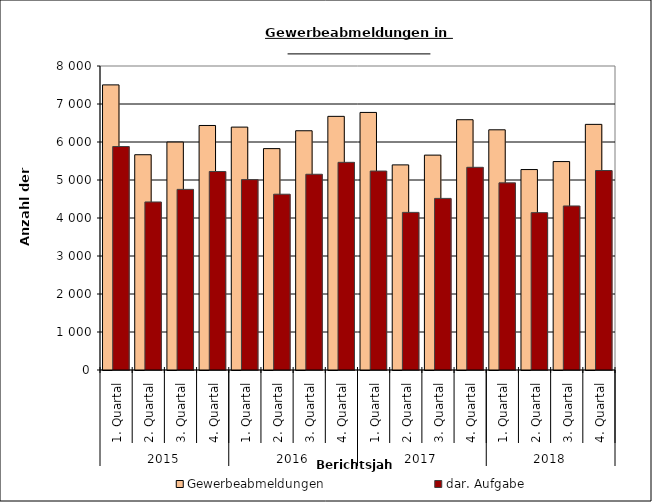
| Category | Gewerbeabmeldungen | dar. Aufgabe |
|---|---|---|
| 0 | 7503 | 5881 |
| 1 | 5665 | 4422 |
| 2 | 5998 | 4753 |
| 3 | 6435 | 5224 |
| 4 | 6392 | 5010 |
| 5 | 5826 | 4626 |
| 6 | 6296 | 5151 |
| 7 | 6675 | 5465 |
| 8 | 6778 | 5236 |
| 9 | 5398 | 4148 |
| 10 | 5655 | 4516 |
| 11 | 6586 | 5334 |
| 12 | 6321 | 4925 |
| 13 | 5275 | 4141 |
| 14 | 5485 | 4317 |
| 15 | 6464 | 5250 |